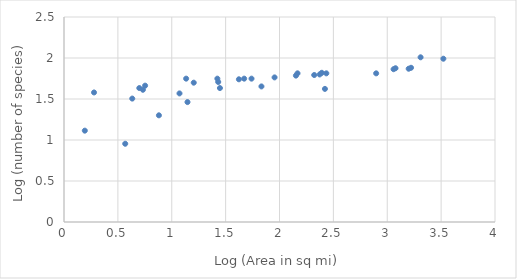
| Category | Series 0 |
|---|---|
| 3.5207454715194824 | 1.991 |
| 3.30941722577814 | 2.009 |
| 3.198931869932209 | 1.869 |
| 3.0588054866759067 | 1.863 |
| 2.3729120029701067 | 1.799 |
| 2.1522883443830563 | 1.785 |
| 1.954242509439325 | 1.763 |
| 1.4313637641589874 | 1.708 |
| 0.7323937598229685 | 1.613 |
| 2.89707700320942 | 1.813 |
| 2.4345689040341987 | 1.813 |
| 2.322219294733919 | 1.792 |
| 1.6232492903979006 | 1.74 |
| 1.423245873936808 | 1.748 |
| 2.392696953259666 | 1.82 |
| 1.7403626894942439 | 1.748 |
| 2.167317334748176 | 1.813 |
| 1.6720978579357175 | 1.748 |
| 3.2208922492195193 | 1.881 |
| 3.076640443670342 | 1.875 |
| 1.8325089127062364 | 1.653 |
| 1.4471580313422192 | 1.633 |
| 1.2041199826559248 | 1.699 |
| 1.146128035678238 | 1.462 |
| 1.1335389083702174 | 1.748 |
| 1.0718820073061255 | 1.568 |
| 0.7528164311882715 | 1.663 |
| 0.6989700043360189 | 1.633 |
| 0.6334684555795865 | 1.505 |
| 0.2787536009528289 | 1.58 |
| 0.1931245983544616 | 1.114 |
| 2.4216039268698313 | 1.623 |
| 0.8808135922807914 | 1.301 |
| 0.568201724066995 | 0.954 |